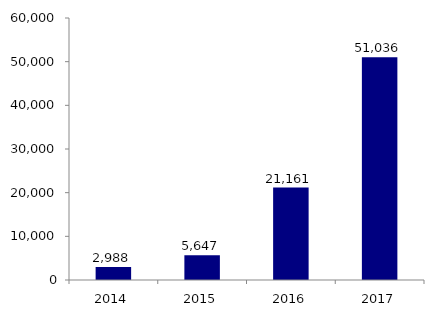
| Category | Nombre de femme ayant eu un dépistage ADNlcT21 |
|---|---|
| 2014.0 | 2988 |
| 2015.0 | 5647 |
| 2016.0 | 21161 |
| 2017.0 | 51036 |